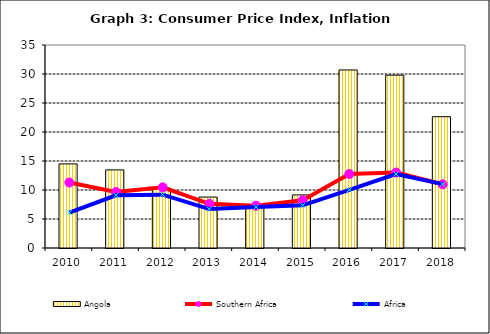
| Category | Angola |
|---|---|
| 2010.0 | 14.5 |
| 2011.0 | 13.467 |
| 2012.0 | 10.293 |
| 2013.0 | 8.78 |
| 2014.0 | 7.28 |
| 2015.0 | 9.152 |
| 2016.0 | 30.695 |
| 2017.0 | 29.799 |
| 2018.0 | 22.635 |